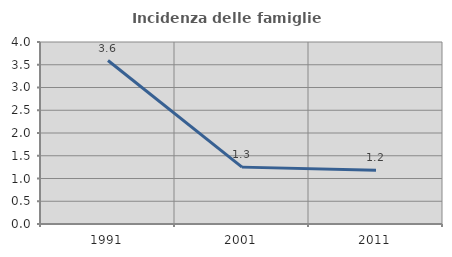
| Category | Incidenza delle famiglie numerose |
|---|---|
| 1991.0 | 3.593 |
| 2001.0 | 1.25 |
| 2011.0 | 1.183 |